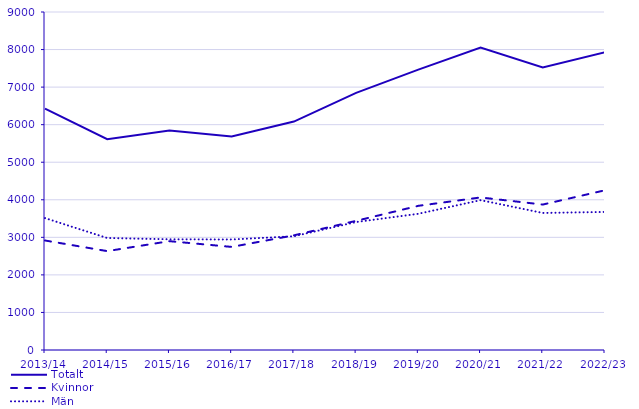
| Category | Totalt | Kvinnor | Män |
|---|---|---|---|
| 2013/14 | 6428 | 2916 | 3512 |
| 2014/15 | 5615 | 2633 | 2982 |
| 2015/16 | 5846 | 2898 | 2948 |
| 2016/17 | 5688 | 2745 | 2943 |
| 2017/18 | 6082 | 3053 | 3029 |
| 2018/19 | 6846 | 3439 | 3407 |
| 2019/20 | 7466 | 3839 | 3627 |
| 2020/21 | 8052 | 4062 | 3990 |
| 2021/22 | 7522 | 3873 | 3649 |
| 2022/23 | 7929 | 4253 | 3676 |